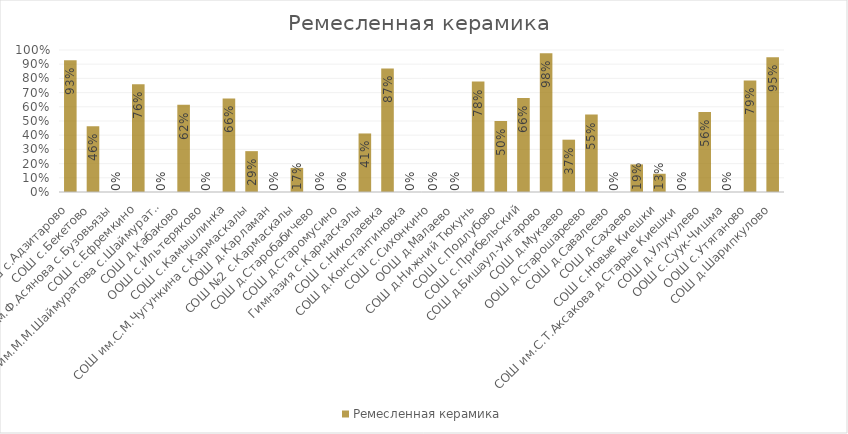
| Category | Ремесленная керамика |
|---|---|
| СОШ с.Адзитарово | 0.929 |
| СОШ с.Бекетово | 0.463 |
| СОШ им.Ф.Асянова с.Бузовьязы | 0 |
| СОШ с.Ефремкино | 0.758 |
| СОШ им.М.М.Шаймуратова с.Шаймуратово | 0 |
| СОШ д.Кабаково | 0.615 |
| ООШ с.Ильтеряково | 0 |
| СОШ с.Камышлинка | 0.659 |
| СОШ им.С.М.Чугункина с.Кармаскалы | 0.288 |
| ООШ д.Карламан | 0 |
| СОШ №2 с.Кармаскалы | 0.17 |
| СОШ д.Старобабичево | 0 |
| СОШ д.Старомусино | 0 |
| Гимназия с.Кармаскалы | 0.412 |
| СОШ с.Николаевка | 0.871 |
| СОШ д.Константиновка | 0 |
| СОШ с.Сихонкино | 0 |
| ООШ д.Малаево | 0 |
| СОШ д.Нижний Тюкунь | 0.778 |
| СОШ с.Подлубово | 0.5 |
| СОШ с.Прибельский | 0.662 |
| СОШ д.Бишаул-Унгарово | 0.978 |
| СОШ д.Мукаево | 0.368 |
| ООШ д.Старошареево | 0.545 |
| СОШ д.Савалеево | 0 |
| СОШ д.Сахаево | 0.195 |
| СОШ с.Новые Киешки | 0.129 |
| СОШ им.С.Т.Аксакова д.Старые Киешки | 0 |
| СОШ д.Улукулево | 0.563 |
| ООШ с.Суук-Чишма | 0 |
| ООШ с.Утяганово | 0.786 |
| СОШ д.Шарипкулово | 0.949 |